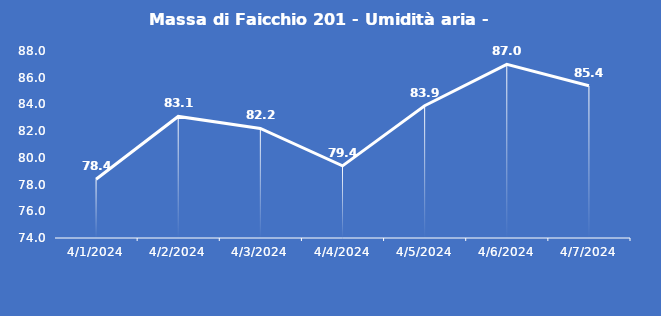
| Category | Massa di Faicchio 201 - Umidità aria - Grezzo (%) |
|---|---|
| 4/1/24 | 78.4 |
| 4/2/24 | 83.1 |
| 4/3/24 | 82.2 |
| 4/4/24 | 79.4 |
| 4/5/24 | 83.9 |
| 4/6/24 | 87 |
| 4/7/24 | 85.4 |